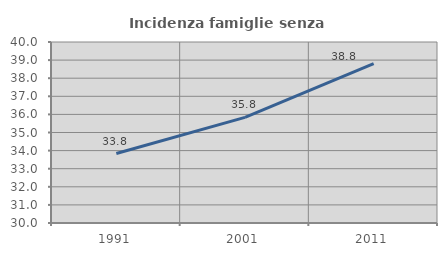
| Category | Incidenza famiglie senza nuclei |
|---|---|
| 1991.0 | 33.837 |
| 2001.0 | 35.833 |
| 2011.0 | 38.802 |